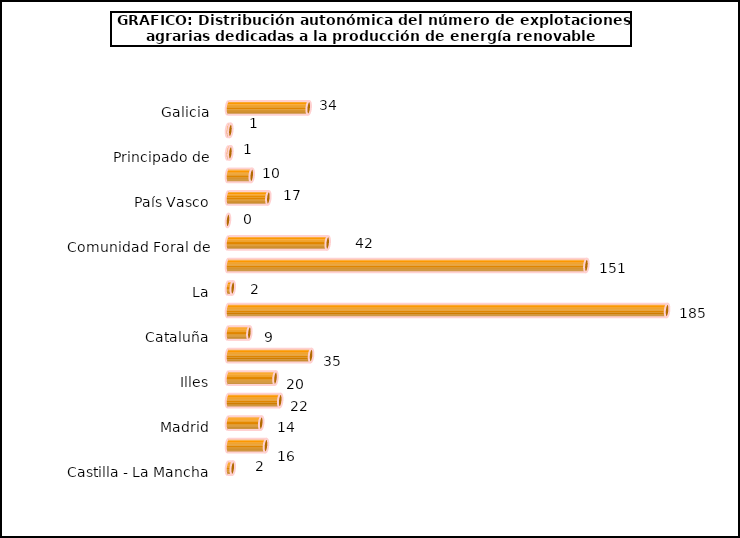
| Category | num. Explotaciones |
|---|---|
| 0 | 34 |
| 1 | 1 |
| 2 | 1 |
| 3 | 10 |
| 4 | 17 |
| 5 | 0 |
| 6 | 42 |
| 7 | 151 |
| 8 | 2 |
| 9 | 185 |
| 10 | 9 |
| 11 | 35 |
| 12 | 20 |
| 13 | 22 |
| 14 | 14 |
| 15 | 16 |
| 16 | 2 |